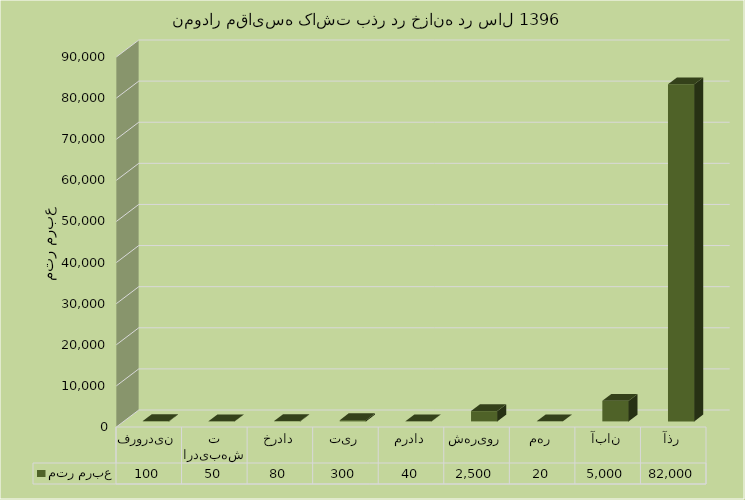
| Category | متر مربع |
|---|---|
| فروردین | 100 |
| اردیبهشت | 50 |
| خرداد | 80 |
| تیر | 300 |
| مرداد | 40 |
| شهریور | 2500 |
| مهر | 20 |
| آبان | 5000 |
| آذر | 82000 |